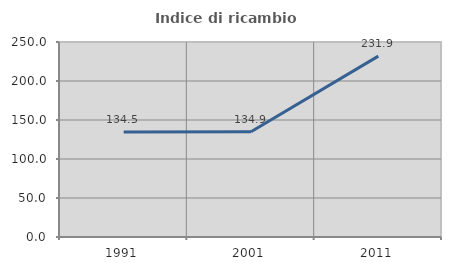
| Category | Indice di ricambio occupazionale  |
|---|---|
| 1991.0 | 134.483 |
| 2001.0 | 134.884 |
| 2011.0 | 231.933 |